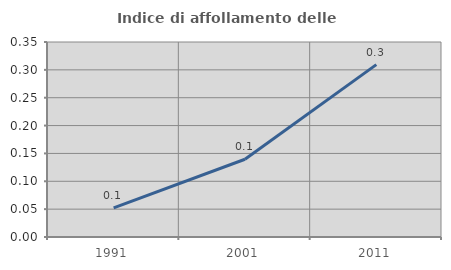
| Category | Indice di affollamento delle abitazioni  |
|---|---|
| 1991.0 | 0.052 |
| 2001.0 | 0.14 |
| 2011.0 | 0.309 |